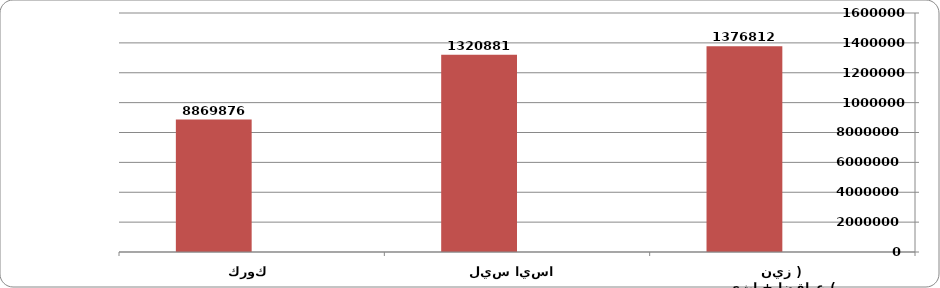
| Category | Series 0 | Series 1 |
|---|---|---|
| زين  ( عراقنا + اثير ) |  | 13768129 |
| اسيا سيل  |  | 13208819 |
| كورك |  | 8869876 |